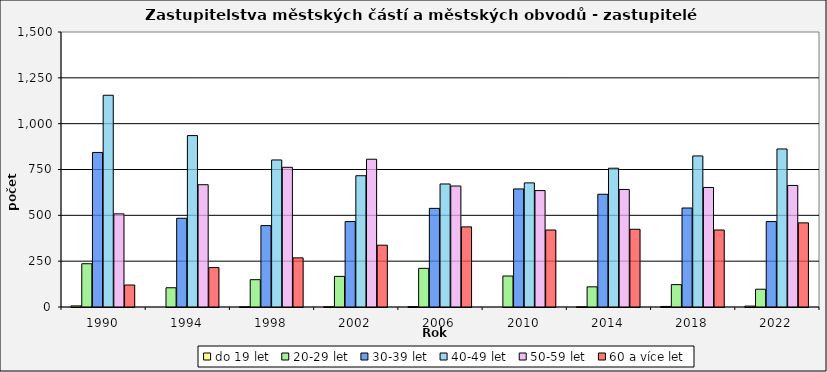
| Category | do 19 let | 20-29 let | 30-39 let | 40-49 let | 50-59 let | 60 a více let |
|---|---|---|---|---|---|---|
| 1990.0 | 6 | 236 | 843 | 1155 | 508 | 120 |
| 1994.0 | 0 | 105 | 484 | 935 | 667 | 215 |
| 1998.0 | 1 | 149 | 444 | 802 | 762 | 268 |
| 2002.0 | 1 | 167 | 466 | 716 | 806 | 337 |
| 2006.0 | 2 | 211 | 538 | 671 | 660 | 437 |
| 2010.0 | 0 | 169 | 644 | 677 | 635 | 420 |
| 2014.0 | 1 | 110 | 615 | 757 | 641 | 424 |
| 2018.0 | 3 | 122 | 540 | 824 | 652 | 420 |
| 2022.0 | 5 | 97 | 466 | 862 | 663 | 459 |